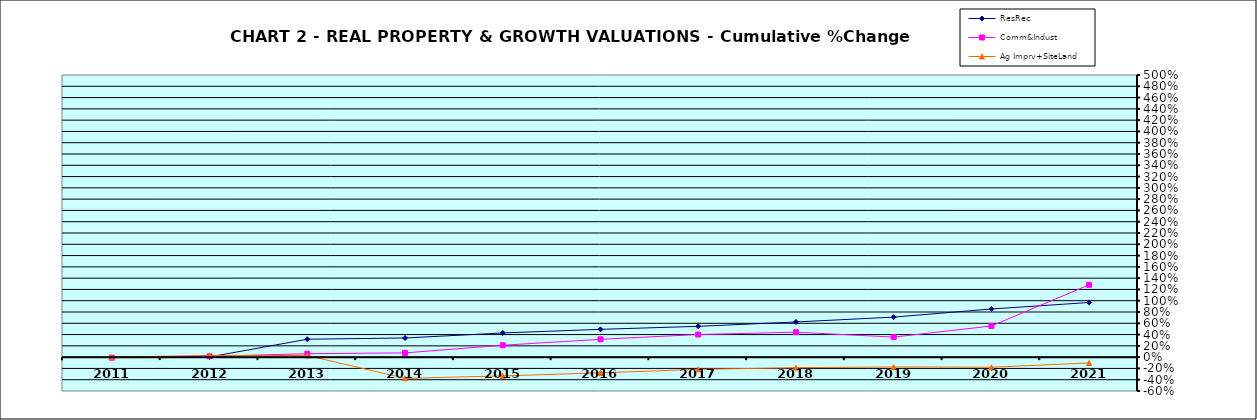
| Category | ResRec | Comm&Indust | Ag Imprv+SiteLand |
|---|---|---|---|
| 2011.0 | -0.006 | -0.01 | 0 |
| 2012.0 | 0.004 | 0.014 | 0.031 |
| 2013.0 | 0.317 | 0.061 | 0.029 |
| 2014.0 | 0.34 | 0.075 | -0.375 |
| 2015.0 | 0.428 | 0.211 | -0.332 |
| 2016.0 | 0.493 | 0.316 | -0.278 |
| 2017.0 | 0.546 | 0.401 | -0.216 |
| 2018.0 | 0.623 | 0.442 | -0.187 |
| 2019.0 | 0.71 | 0.355 | -0.174 |
| 2020.0 | 0.853 | 0.552 | -0.179 |
| 2021.0 | 0.969 | 1.282 | -0.103 |